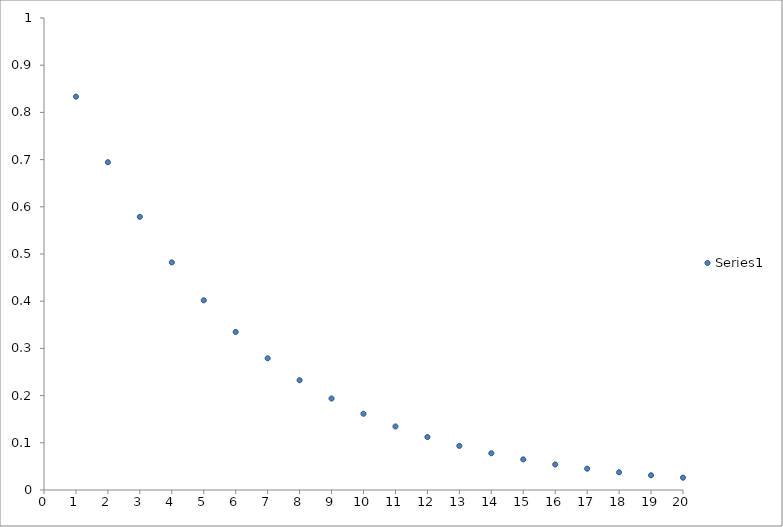
| Category | Series 0 |
|---|---|
| 1.0 | 0.833 |
| 2.0 | 0.694 |
| 3.0 | 0.579 |
| 4.0 | 0.482 |
| 5.0 | 0.402 |
| 6.0 | 0.335 |
| 7.0 | 0.279 |
| 8.0 | 0.233 |
| 9.0 | 0.194 |
| 10.0 | 0.162 |
| 11.0 | 0.135 |
| 12.0 | 0.112 |
| 13.0 | 0.093 |
| 14.0 | 0.078 |
| 15.0 | 0.065 |
| 16.0 | 0.054 |
| 17.0 | 0.045 |
| 18.0 | 0.038 |
| 19.0 | 0.031 |
| 20.0 | 0.026 |